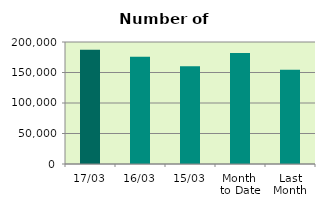
| Category | Series 0 |
|---|---|
| 17/03 | 187318 |
| 16/03 | 175626 |
| 15/03 | 160206 |
| Month 
to Date | 182142.769 |
| Last
Month | 154356.5 |